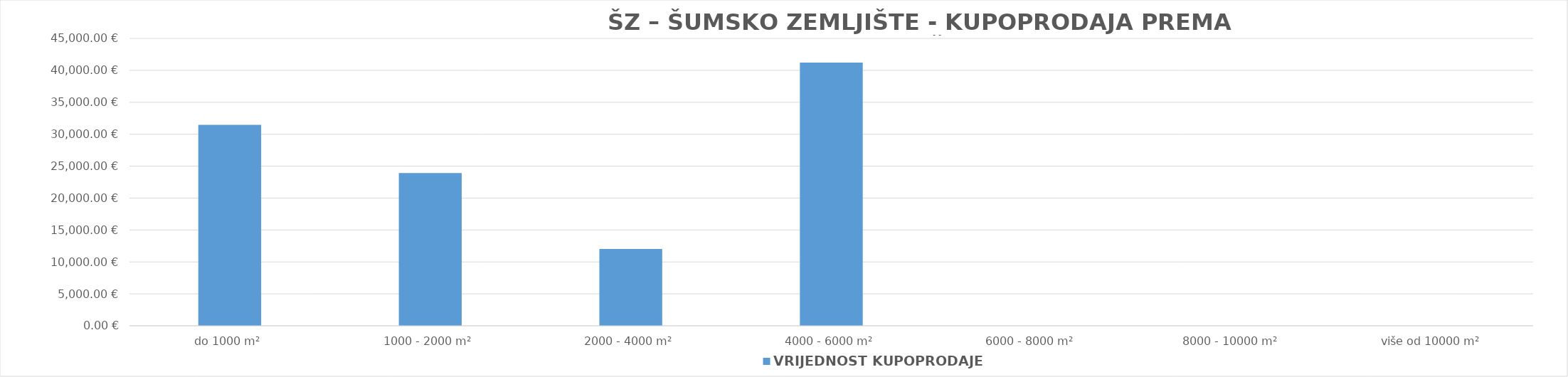
| Category | VRIJEDNOST KUPOPRODAJE 
(u EUR) |
|---|---|
| do 1000 m² | 31468.519 |
| 1000 - 2000 m² | 23919.872 |
| 2000 - 4000 m² | 12022.964 |
| 4000 - 6000 m² | 41206.809 |
| 6000 - 8000 m² | 0 |
| 8000 - 10000 m² | 0 |
| više od 10000 m² | 0 |